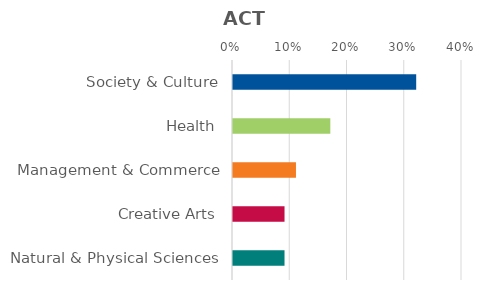
| Category | Series 0 |
|---|---|
| Society & Culture | 0.32 |
| Health | 0.17 |
| Management & Commerce | 0.11 |
| Creative Arts | 0.09 |
| Natural & Physical Sciences | 0.09 |